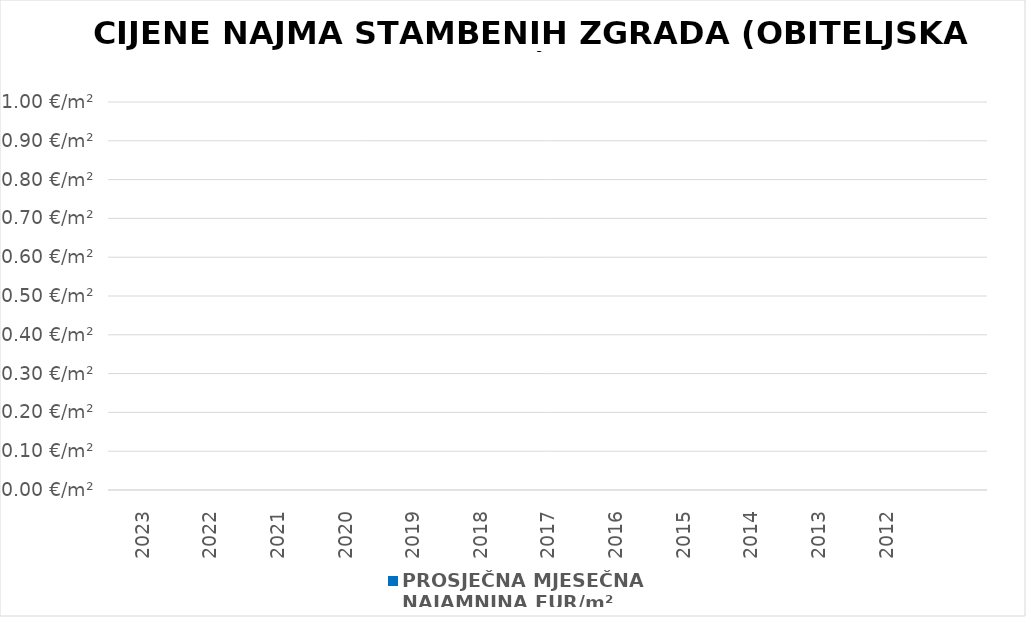
| Category | PROSJEČNA MJESEČNA 
NAJAMNINA EUR/m² |
|---|---|
| 2023 | 0 |
| 2022 | 0 |
| 2021 | 0 |
| 2020 | 0 |
| 2019 | 0 |
| 2018 | 0 |
| 2017 | 0 |
| 2016 | 0 |
| 2015 | 0 |
| 2014 | 0 |
| 2013 | 0 |
| 2012 | 0 |